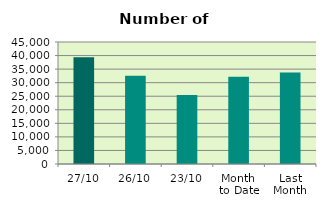
| Category | Series 0 |
|---|---|
| 27/10 | 39386 |
| 26/10 | 32586 |
| 23/10 | 25464 |
| Month 
to Date | 32168 |
| Last
Month | 33733.273 |